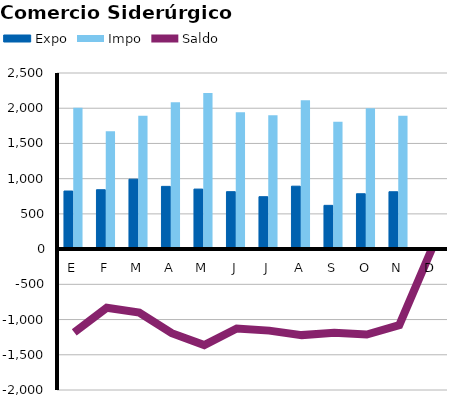
| Category | Expo | Impo |
|---|---|---|
| E | 824.674 | 2006.183 |
| F | 842.891 | 1674.532 |
| M | 992.766 | 1893.101 |
| A | 890.76 | 2084.035 |
| M | 852.143 | 2214.866 |
| J | 815.182 | 1941.478 |
| J | 744.005 | 1901.137 |
| A | 893.288 | 2114.146 |
| S | 621.271 | 1807.969 |
| O | 786.007 | 1998.035 |
| N | 814.353 | 1894.254 |
| D | 0 | 0 |